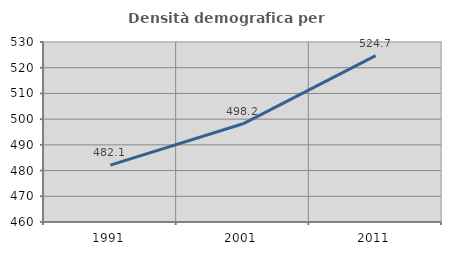
| Category | Densità demografica |
|---|---|
| 1991.0 | 482.098 |
| 2001.0 | 498.192 |
| 2011.0 | 524.687 |